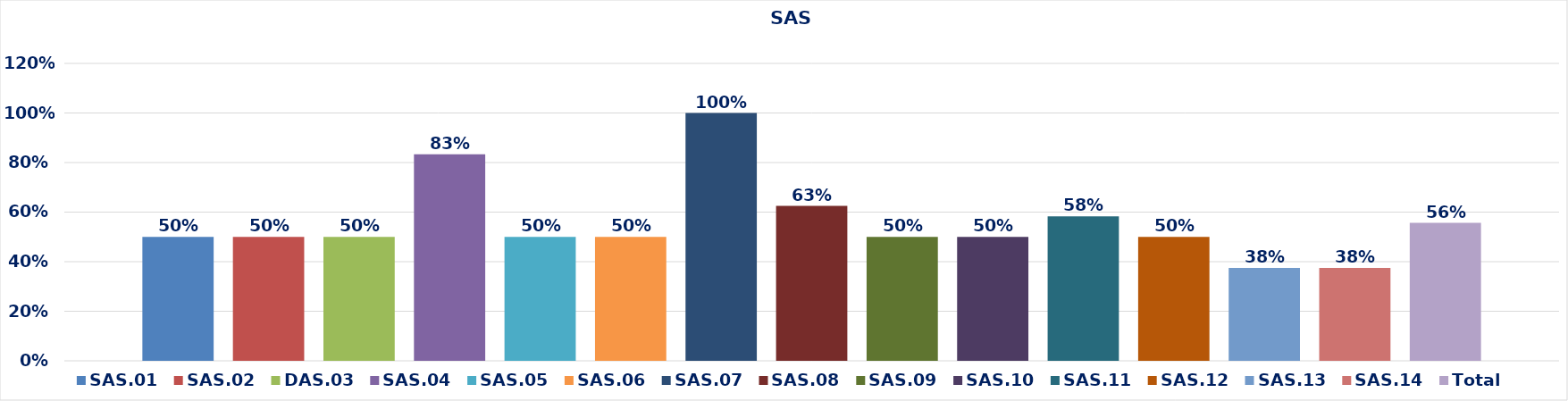
| Category | SAS.01 | SAS.02 | DAS.03 | SAS.04 | SAS.05 | SAS.06 | SAS.07 | SAS.08 | SAS.09 | SAS.10 | SAS.11 | SAS.12 | SAS.13 | SAS.14 | Total |
|---|---|---|---|---|---|---|---|---|---|---|---|---|---|---|---|
| 0 | 0.5 | 0.5 | 0.5 | 0.833 | 0.5 | 0.5 | 1 | 0.625 | 0.5 | 0.5 | 0.583 | 0.5 | 0.375 | 0.375 | 0.557 |